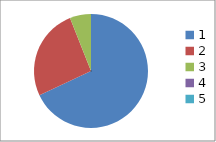
| Category | Series 0 |
|---|---|
| 0 | 0.68 |
| 1 | 0.26 |
| 2 | 0.06 |
| 3 | 0 |
| 4 | 0 |